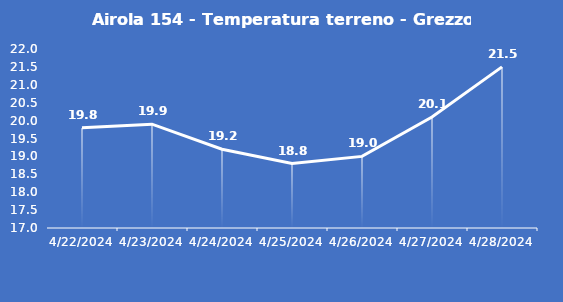
| Category | Airola 154 - Temperatura terreno - Grezzo (°C) |
|---|---|
| 4/22/24 | 19.8 |
| 4/23/24 | 19.9 |
| 4/24/24 | 19.2 |
| 4/25/24 | 18.8 |
| 4/26/24 | 19 |
| 4/27/24 | 20.1 |
| 4/28/24 | 21.5 |